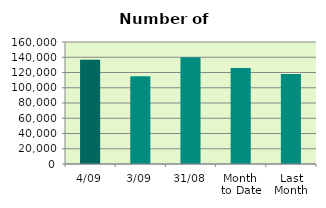
| Category | Series 0 |
|---|---|
| 4/09 | 136618 |
| 3/09 | 115016 |
| 31/08 | 140124 |
| Month 
to Date | 125817 |
| Last
Month | 118077.217 |